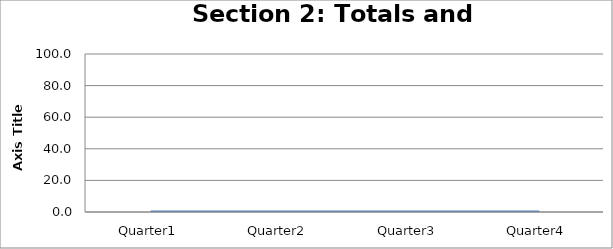
| Category | Section 2: Totals and Compliance |
|---|---|
| Quarter1 | 0 |
| Quarter2 | 0 |
| Quarter3 | 0 |
| Quarter4 | 0 |